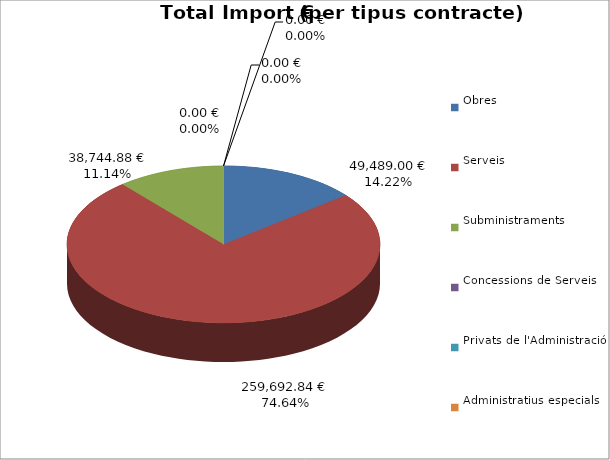
| Category | Total preu
(amb IVA) |
|---|---|
| Obres | 49489 |
| Serveis | 259692.84 |
| Subministraments | 38744.88 |
| Concessions de Serveis | 0 |
| Privats de l'Administració | 0 |
| Administratius especials | 0 |